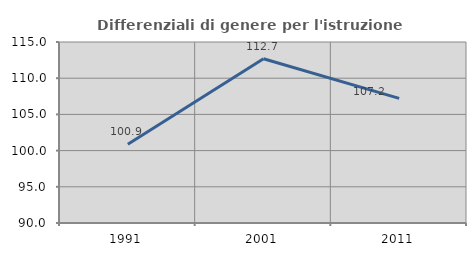
| Category | Differenziali di genere per l'istruzione superiore |
|---|---|
| 1991.0 | 100.866 |
| 2001.0 | 112.688 |
| 2011.0 | 107.21 |